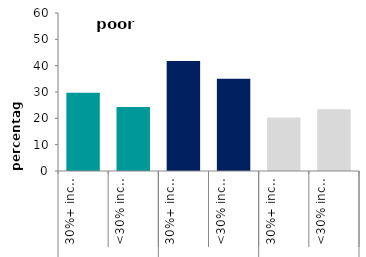
| Category | poor housing |
|---|---|
| 0 | 29.684 |
| 1 | 24.265 |
| 2 | 41.74 |
| 3 | 35.023 |
| 4 | 20.356 |
| 5 | 23.45 |